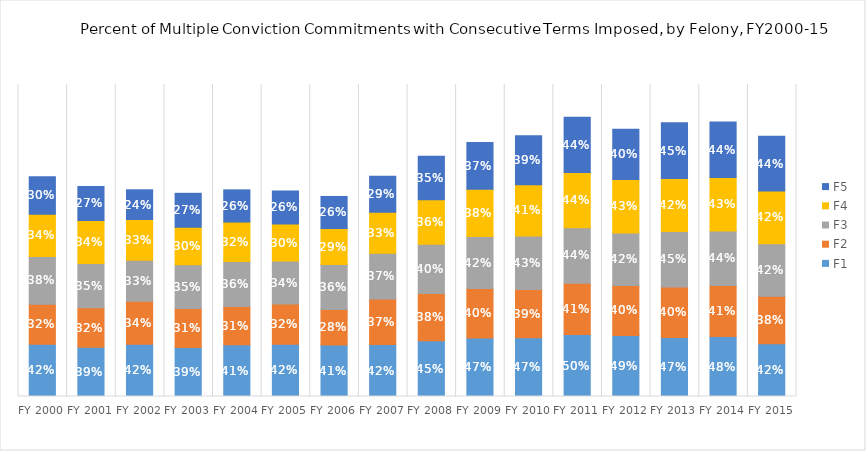
| Category | F1 | F2 | F3 | F4 | F5 |
|---|---|---|---|---|---|
| FY 2000 | 0.419 | 0.321 | 0.383 | 0.338 | 0.301 |
| FY 2001 | 0.394 | 0.317 | 0.354 | 0.345 | 0.273 |
| FY 2002 | 0.42 | 0.343 | 0.33 | 0.326 | 0.238 |
| FY 2003 | 0.392 | 0.313 | 0.351 | 0.301 | 0.272 |
| FY 2004 | 0.415 | 0.307 | 0.361 | 0.315 | 0.258 |
| FY 2005 | 0.418 | 0.322 | 0.345 | 0.297 | 0.264 |
| FY 2006 | 0.412 | 0.285 | 0.361 | 0.289 | 0.257 |
| FY 2007 | 0.416 | 0.366 | 0.366 | 0.329 | 0.289 |
| FY 2008 | 0.446 | 0.378 | 0.396 | 0.357 | 0.347 |
| FY 2009 | 0.469 | 0.396 | 0.417 | 0.379 | 0.374 |
| FY 2010 | 0.471 | 0.387 | 0.428 | 0.411 | 0.392 |
| FY 2011 | 0.496 | 0.412 | 0.444 | 0.443 | 0.443 |
| FY 2012 | 0.49 | 0.4 | 0.421 | 0.428 | 0.402 |
| FY 2013 | 0.474 | 0.404 | 0.445 | 0.425 | 0.447 |
| FY 2014 | 0.48 | 0.409 | 0.436 | 0.43 | 0.444 |
| FY 2015 | 0.423 | 0.381 | 0.422 | 0.421 | 0.439 |